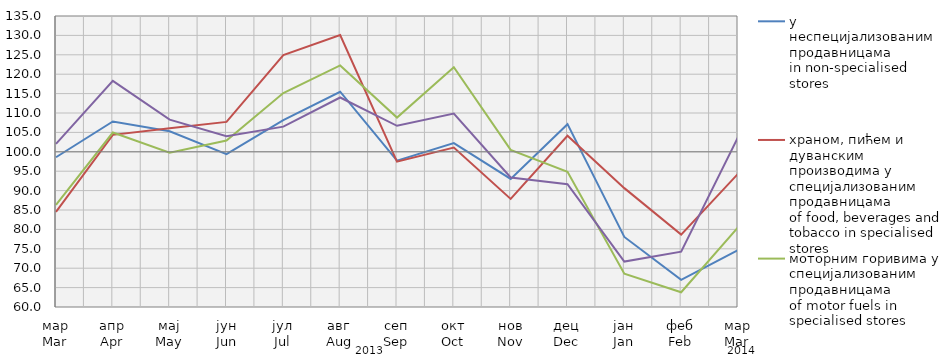
| Category | у неспецијализованим продавницама
in non-specialised stores | храном, пићем и дуванским производима у специјализовaним продавницама
of food, beverages and tobacco in specialised stores | моторним горивима у специјализованим продавницама
of motor fuels in specialised stores | остала
other |
|---|---|---|---|---|
| мар
Mar | 98.6 | 84.535 | 86.311 | 102.025 |
| апр
Apr | 107.82 | 104.374 | 104.963 | 118.299 |
| мај
May | 105.292 | 106.059 | 99.786 | 108.286 |
| јун
Jun | 99.408 | 107.704 | 102.888 | 103.986 |
| јул
Jul | 108.16 | 124.929 | 115.152 | 106.482 |
| авг
Aug | 115.48 | 130.093 | 122.253 | 113.997 |
| сеп
Sep | 97.717 | 97.467 | 108.827 | 106.7 |
| окт
Oct | 102.24 | 101.077 | 121.799 | 109.868 |
| нов
Nov | 93.024 | 87.862 | 100.498 | 93.38 |
| дец
Dec | 107.124 | 104.135 | 94.83 | 91.634 |
| јан
Jan | 78.06 | 90.633 | 68.559 | 71.709 |
| феб
Feb | 66.985 | 78.662 | 63.807 | 74.254 |
| мар
Mar | 74.689 | 94.336 | 80.553 | 103.781 |